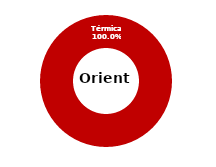
| Category | Oriente |
|---|---|
| Eólica | 0 |
| Hidráulica | 0 |
| Solar | 0 |
| Térmica | 27.365 |